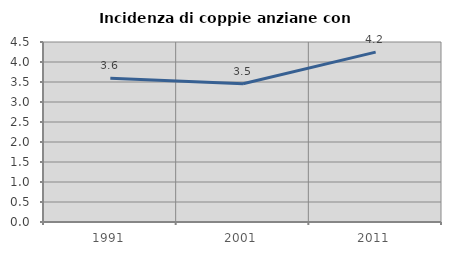
| Category | Incidenza di coppie anziane con figli |
|---|---|
| 1991.0 | 3.592 |
| 2001.0 | 3.458 |
| 2011.0 | 4.247 |